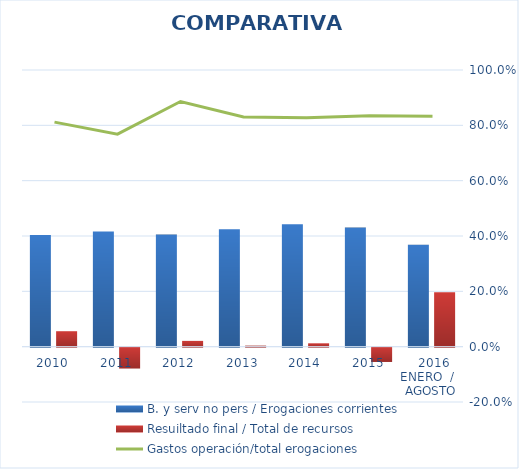
| Category | B. y serv no pers / Erogaciones corrientes | Resuiltado final / Total de recursos |
|---|---|---|
| 2010 | 0.403 | 0.056 |
| 2011 | 0.416 | -0.075 |
| 2012 | 0.405 | 0.021 |
| 2013 | 0.424 | 0.004 |
| 2014 | 0.442 | 0.012 |
| 2015 | 0.431 | -0.052 |
|  2016 ENERO  /   AGOSTO | 0.369 | 0.196 |